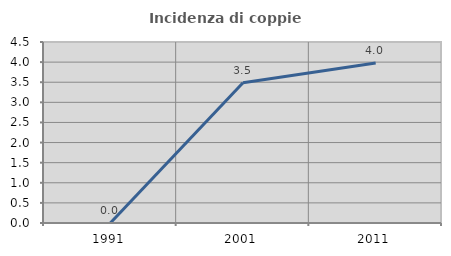
| Category | Incidenza di coppie miste |
|---|---|
| 1991.0 | 0 |
| 2001.0 | 3.488 |
| 2011.0 | 3.98 |